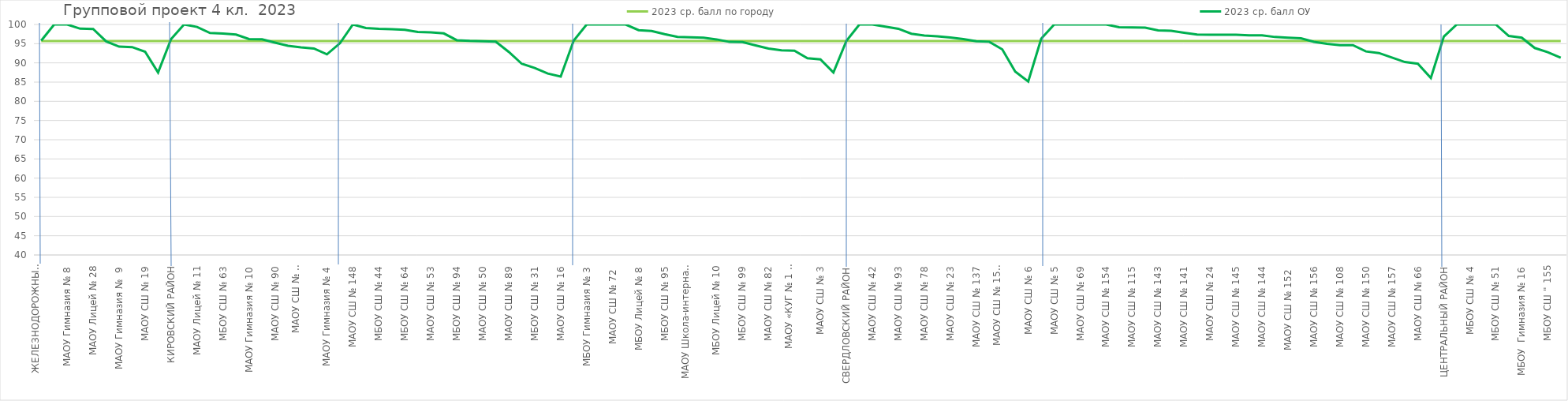
| Category | 2023 ср. балл по городу | 2023 ср. балл ОУ |
|---|---|---|
| ЖЕЛЕЗНОДОРОЖНЫЙ РАЙОН | 95.71 | 95.788 |
| МБОУ Прогимназия  № 131 | 95.71 | 100 |
| МАОУ Гимназия № 8 | 95.71 | 100 |
| МАОУ СШ  № 12 | 95.71 | 98.901 |
| МАОУ Лицей № 28 | 95.71 | 98.824 |
| МАОУ СШ № 32 | 95.71 | 95.604 |
| МАОУ Гимназия №  9 | 95.71 | 94.231 |
| МАОУ Лицей № 7 | 95.71 | 94.118 |
| МАОУ СШ № 19 | 95.71 | 92.913 |
| МБОУ СШ № 86  | 95.71 | 87.5 |
| КИРОВСКИЙ РАЙОН | 95.71 | 96.186 |
| МАОУ Гимназия № 6 | 95.71 | 100 |
| МАОУ Лицей № 11 | 95.71 | 99.367 |
| МАОУ Лицей № 6 "Перспектива" | 95.71 | 97.778 |
| МБОУ СШ № 63 | 95.71 | 97.619 |
| МАОУ СШ № 55 | 95.71 | 97.368 |
| МАОУ Гимназия № 10 | 95.71 | 96.19 |
| МАОУ СШ № 46 | 95.71 | 96.154 |
| МАОУ СШ № 90 | 95.71 | 95.27 |
| МАОУ СШ № 135 | 95.71 | 94.444 |
| МАОУ СШ № 8 "Созидание" | 95.71 | 94.059 |
| МАОУ СШ № 81 | 95.71 | 93.75 |
| МАОУ Гимназия № 4 | 95.71 | 92.233 |
| ЛЕНИНСКИЙ РАЙОН | 95.71 | 95.103 |
| МАОУ СШ № 148 | 95.71 | 100 |
| МАОУ Гимназия № 11  | 95.71 | 99.083 |
| МБОУ СШ № 44 | 95.71 | 98.864 |
| МАОУ Гимназия № 15 | 95.71 | 98.765 |
| МБОУ СШ № 64 | 95.71 | 98.611 |
| МБОУ СШ № 13 | 95.71 | 98.039 |
| МАОУ СШ № 53 | 95.71 | 97.938 |
| МАОУ СШ № 65 | 95.71 | 97.674 |
| МБОУ СШ № 94 | 95.71 | 95.902 |
| МАОУ Лицей № 12 | 95.71 | 95.714 |
| МАОУ СШ № 50 | 95.71 | 95.652 |
| МАОУ Лицей № 3 | 95.71 | 95.536 |
| МАОУ СШ № 89 | 95.71 | 92.857 |
| МБОУ СШ № 79 | 95.71 | 89.773 |
| МБОУ СШ № 31 | 95.71 | 88.679 |
| МБОУ Гимназия № 7 | 95.71 | 87.234 |
| МАОУ СШ № 16 | 95.71 | 86.429 |
| ОКТЯБРЬСКИЙ РАЙОН | 95.71 | 95.782 |
| МБОУ Гимназия № 3 | 95.71 | 100 |
| МБОУ СШ № 36 | 95.71 | 100 |
| МАОУ СШ № 72  | 95.71 | 100 |
| МБОУ СШ № 73 | 95.71 | 100 |
| МБОУ Лицей № 8 | 95.71 | 98.529 |
| МАОУ Лицей № 1 | 95.71 | 98.298 |
| МБОУ СШ № 95 | 95.71 | 97.479 |
| МАОУ Гимназия № 13 "Академ" | 95.71 | 96.774 |
| МАОУ Школа-интернат № 1 | 95.71 | 96.667 |
| МБОУ СШ № 30 | 95.71 | 96.552 |
| МБОУ Лицей № 10 | 95.71 | 96.117 |
| МБОУ СШ № 21 | 95.71 | 95.455 |
| МБОУ СШ № 99 | 95.71 | 95.42 |
| МБОУ СШ № 39 | 95.71 | 94.545 |
| МАОУ СШ № 82 | 95.71 | 93.75 |
| МАОУ СШ № 159 | 95.71 | 93.269 |
| МАОУ «КУГ № 1 – Универс» | 95.71 | 93.173 |
| МБОУ СШ № 84 | 95.71 | 91.209 |
| МАОУ СШ № 3 | 95.71 | 90.909 |
| МБОУ СШ № 133 | 95.71 | 87.5 |
| СВЕРДЛОВСКИЙ РАЙОН | 95.71 | 95.732 |
| МАОУ Гимназия № 14 | 95.71 | 100 |
| МАОУ СШ № 42 | 95.71 | 100 |
| МАОУ СШ № 45 | 95.71 | 99.422 |
| МАОУ СШ № 93 | 95.71 | 98.889 |
| МАОУ СШ № 17 | 95.71 | 97.59 |
| МАОУ СШ № 78 | 95.71 | 97.143 |
| МБОУ СШ № 62 | 95.71 | 96.923 |
| МАОУ СШ № 23 | 95.71 | 96.591 |
| МАОУ СШ № 76 | 95.71 | 96.196 |
| МАОУ СШ № 137 | 95.71 | 95.614 |
| МАОУ СШ № 34 | 95.71 | 95.506 |
| МАОУ СШ № 158 "Грани" | 95.71 | 93.514 |
| МАОУ Лицей № 9 "Лидер" | 95.71 | 87.719 |
| МАОУ СШ № 6 | 95.71 | 85.149 |
| СОВЕТСКИЙ РАЙОН | 95.71 | 96.283 |
| МАОУ СШ № 5 | 95.71 | 100 |
| МБОУ СШ № 56 | 95.71 | 100 |
| МАОУ СШ № 69 | 95.71 | 100 |
| МБОУ СШ № 129 | 95.71 | 100 |
| МАОУ СШ № 154 | 95.71 | 100 |
| МАОУ СШ № 149 | 95.71 | 99.273 |
| МАОУ СШ № 115 | 95.71 | 99.213 |
| МАОУ СШ № 7 | 95.71 | 99.187 |
| МАОУ СШ № 143 | 95.71 | 98.479 |
| МБОУ СШ № 147 | 95.71 | 98.361 |
| МАОУ СШ № 141 | 95.71 | 97.849 |
| МБОУ СШ № 98 | 95.71 | 97.403 |
| МАОУ СШ № 24 | 95.71 | 97.345 |
| МАОУ СШ № 121 | 95.71 | 97.333 |
| МАОУ СШ № 145 | 95.71 | 97.326 |
| МАОУ СШ № 134 | 95.71 | 97.163 |
| МАОУ СШ № 144 | 95.71 | 97.154 |
| МАОУ СШ № 1 | 95.71 | 96.739 |
| МАОУ СШ № 152  | 95.71 | 96.552 |
| МАОУ СШ № 139 | 95.71 | 96.386 |
| МАОУ СШ № 156 | 95.71 | 95.479 |
| МАОУ СШ № 18 | 95.71 | 94.969 |
| МАОУ СШ № 108 | 95.71 | 94.631 |
| МАОУ СШ № 85 | 95.71 | 94.615 |
| МАОУ СШ № 150 | 95.71 | 92.982 |
| МАОУ СШ № 151 | 95.71 | 92.571 |
| МАОУ СШ № 157 | 95.71 | 91.391 |
| МБОУ СШ № 91 | 95.71 | 90.217 |
| МАОУ СШ № 66 | 95.71 | 89.796 |
| МБОУ СШ № 2 | 95.71 | 86.076 |
| ЦЕНТРАЛЬНЫЙ РАЙОН | 95.71 | 96.841 |
| МАОУ Гимназия № 2 | 95.71 | 100 |
| МБОУ СШ № 4 | 95.71 | 100 |
| МБОУ СШ № 10  | 95.71 | 100 |
| МБОУ СШ № 51 | 95.71 | 100 |
| МБОУ СШ № 27 | 95.71 | 97.015 |
| МБОУ  Гимназия № 16 | 95.71 | 96.552 |
| МБОУ Лицей № 2 | 95.71 | 93.878 |
| МБОУ СШ " 155 | 95.71 | 92.787 |
| МАОУ СШ "Комплекс Покровский" | 95.71 | 91.337 |